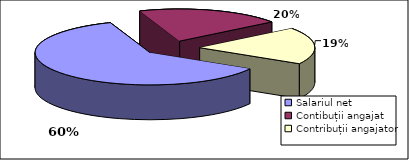
| Category | Series 0 |
|---|---|
| Salariul net | 749.4 |
| Contibuții angajat | 250.6 |
| Contribuții angajator | 227.68 |